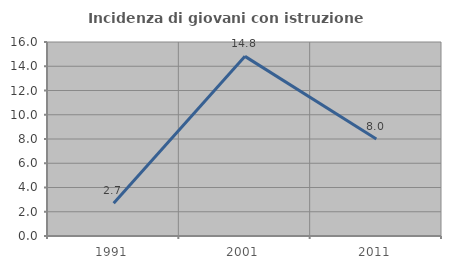
| Category | Incidenza di giovani con istruzione universitaria |
|---|---|
| 1991.0 | 2.703 |
| 2001.0 | 14.815 |
| 2011.0 | 8 |